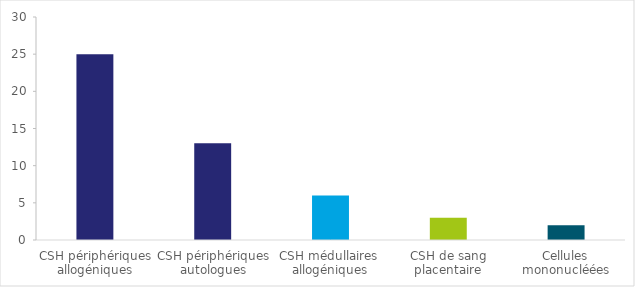
| Category | Series 0 |
|---|---|
| CSH périphériques allogéniques | 25 |
| CSH périphériques autologues | 13 |
| CSH médullaires  allogéniques | 6 |
| CSH de sang placentaire | 3 |
| Cellules mononucléées | 2 |